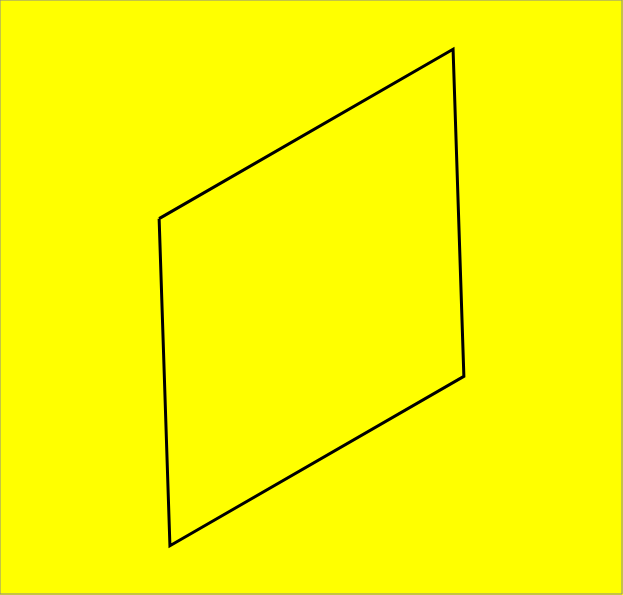
| Category | Series 0 |
|---|---|
| -5.13923773151656 | 2.793 |
| 4.7747578082214295 | 8.786 |
| 5.139237731516561 | -2.793 |
| -4.774757808221429 | -8.786 |
| -5.13923773151656 | 2.793 |